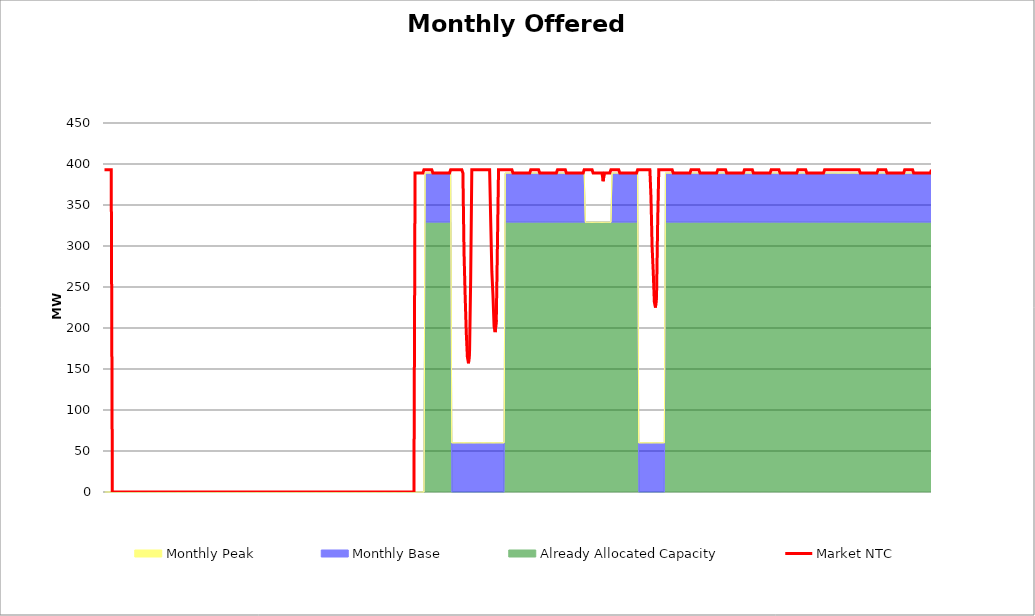
| Category | Market NTC |
|---|---|
| 0 | 393 |
| 1 | 393 |
| 2 | 393 |
| 3 | 393 |
| 4 | 393 |
| 5 | 393 |
| 6 | 393 |
| 7 | 0 |
| 8 | 0 |
| 9 | 0 |
| 10 | 0 |
| 11 | 0 |
| 12 | 0 |
| 13 | 0 |
| 14 | 0 |
| 15 | 0 |
| 16 | 0 |
| 17 | 0 |
| 18 | 0 |
| 19 | 0 |
| 20 | 0 |
| 21 | 0 |
| 22 | 0 |
| 23 | 0 |
| 24 | 0 |
| 25 | 0 |
| 26 | 0 |
| 27 | 0 |
| 28 | 0 |
| 29 | 0 |
| 30 | 0 |
| 31 | 0 |
| 32 | 0 |
| 33 | 0 |
| 34 | 0 |
| 35 | 0 |
| 36 | 0 |
| 37 | 0 |
| 38 | 0 |
| 39 | 0 |
| 40 | 0 |
| 41 | 0 |
| 42 | 0 |
| 43 | 0 |
| 44 | 0 |
| 45 | 0 |
| 46 | 0 |
| 47 | 0 |
| 48 | 0 |
| 49 | 0 |
| 50 | 0 |
| 51 | 0 |
| 52 | 0 |
| 53 | 0 |
| 54 | 0 |
| 55 | 0 |
| 56 | 0 |
| 57 | 0 |
| 58 | 0 |
| 59 | 0 |
| 60 | 0 |
| 61 | 0 |
| 62 | 0 |
| 63 | 0 |
| 64 | 0 |
| 65 | 0 |
| 66 | 0 |
| 67 | 0 |
| 68 | 0 |
| 69 | 0 |
| 70 | 0 |
| 71 | 0 |
| 72 | 0 |
| 73 | 0 |
| 74 | 0 |
| 75 | 0 |
| 76 | 0 |
| 77 | 0 |
| 78 | 0 |
| 79 | 0 |
| 80 | 0 |
| 81 | 0 |
| 82 | 0 |
| 83 | 0 |
| 84 | 0 |
| 85 | 0 |
| 86 | 0 |
| 87 | 0 |
| 88 | 0 |
| 89 | 0 |
| 90 | 0 |
| 91 | 0 |
| 92 | 0 |
| 93 | 0 |
| 94 | 0 |
| 95 | 0 |
| 96 | 0 |
| 97 | 0 |
| 98 | 0 |
| 99 | 0 |
| 100 | 0 |
| 101 | 0 |
| 102 | 0 |
| 103 | 0 |
| 104 | 0 |
| 105 | 0 |
| 106 | 0 |
| 107 | 0 |
| 108 | 0 |
| 109 | 0 |
| 110 | 0 |
| 111 | 0 |
| 112 | 0 |
| 113 | 0 |
| 114 | 0 |
| 115 | 0 |
| 116 | 0 |
| 117 | 0 |
| 118 | 0 |
| 119 | 0 |
| 120 | 0 |
| 121 | 0 |
| 122 | 0 |
| 123 | 0 |
| 124 | 0 |
| 125 | 0 |
| 126 | 0 |
| 127 | 0 |
| 128 | 0 |
| 129 | 0 |
| 130 | 0 |
| 131 | 0 |
| 132 | 0 |
| 133 | 0 |
| 134 | 0 |
| 135 | 0 |
| 136 | 0 |
| 137 | 0 |
| 138 | 0 |
| 139 | 0 |
| 140 | 0 |
| 141 | 0 |
| 142 | 0 |
| 143 | 0 |
| 144 | 0 |
| 145 | 0 |
| 146 | 0 |
| 147 | 0 |
| 148 | 0 |
| 149 | 0 |
| 150 | 0 |
| 151 | 0 |
| 152 | 0 |
| 153 | 0 |
| 154 | 0 |
| 155 | 0 |
| 156 | 0 |
| 157 | 0 |
| 158 | 0 |
| 159 | 0 |
| 160 | 0 |
| 161 | 0 |
| 162 | 0 |
| 163 | 0 |
| 164 | 0 |
| 165 | 0 |
| 166 | 0 |
| 167 | 0 |
| 168 | 0 |
| 169 | 0 |
| 170 | 0 |
| 171 | 0 |
| 172 | 0 |
| 173 | 0 |
| 174 | 0 |
| 175 | 0 |
| 176 | 0 |
| 177 | 0 |
| 178 | 0 |
| 179 | 0 |
| 180 | 0 |
| 181 | 0 |
| 182 | 0 |
| 183 | 0 |
| 184 | 0 |
| 185 | 0 |
| 186 | 0 |
| 187 | 0 |
| 188 | 0 |
| 189 | 0 |
| 190 | 0 |
| 191 | 0 |
| 192 | 0 |
| 193 | 0 |
| 194 | 0 |
| 195 | 0 |
| 196 | 0 |
| 197 | 0 |
| 198 | 0 |
| 199 | 0 |
| 200 | 0 |
| 201 | 0 |
| 202 | 0 |
| 203 | 0 |
| 204 | 0 |
| 205 | 0 |
| 206 | 0 |
| 207 | 0 |
| 208 | 0 |
| 209 | 0 |
| 210 | 0 |
| 211 | 0 |
| 212 | 0 |
| 213 | 0 |
| 214 | 0 |
| 215 | 0 |
| 216 | 0 |
| 217 | 0 |
| 218 | 0 |
| 219 | 0 |
| 220 | 0 |
| 221 | 0 |
| 222 | 0 |
| 223 | 0 |
| 224 | 0 |
| 225 | 0 |
| 226 | 0 |
| 227 | 0 |
| 228 | 0 |
| 229 | 0 |
| 230 | 0 |
| 231 | 0 |
| 232 | 0 |
| 233 | 0 |
| 234 | 0 |
| 235 | 0 |
| 236 | 0 |
| 237 | 0 |
| 238 | 0 |
| 239 | 0 |
| 240 | 0 |
| 241 | 0 |
| 242 | 0 |
| 243 | 0 |
| 244 | 0 |
| 245 | 0 |
| 246 | 0 |
| 247 | 0 |
| 248 | 0 |
| 249 | 0 |
| 250 | 0 |
| 251 | 0 |
| 252 | 0 |
| 253 | 0 |
| 254 | 0 |
| 255 | 0 |
| 256 | 0 |
| 257 | 0 |
| 258 | 0 |
| 259 | 0 |
| 260 | 0 |
| 261 | 0 |
| 262 | 0 |
| 263 | 0 |
| 264 | 0 |
| 265 | 0 |
| 266 | 0 |
| 267 | 0 |
| 268 | 0 |
| 269 | 0 |
| 270 | 0 |
| 271 | 0 |
| 272 | 0 |
| 273 | 0 |
| 274 | 0 |
| 275 | 0 |
| 276 | 0 |
| 277 | 0 |
| 278 | 0 |
| 279 | 389 |
| 280 | 389 |
| 281 | 389 |
| 282 | 389 |
| 283 | 389 |
| 284 | 389 |
| 285 | 389 |
| 286 | 389 |
| 287 | 393 |
| 288 | 393 |
| 289 | 393 |
| 290 | 393 |
| 291 | 393 |
| 292 | 393 |
| 293 | 393 |
| 294 | 393 |
| 295 | 389 |
| 296 | 389 |
| 297 | 389 |
| 298 | 389 |
| 299 | 389 |
| 300 | 389 |
| 301 | 389 |
| 302 | 389 |
| 303 | 389 |
| 304 | 389 |
| 305 | 389 |
| 306 | 389 |
| 307 | 389 |
| 308 | 389 |
| 309 | 389 |
| 310 | 389 |
| 311 | 393 |
| 312 | 393 |
| 313 | 393 |
| 314 | 393 |
| 315 | 393 |
| 316 | 393 |
| 317 | 393 |
| 318 | 393 |
| 319 | 393 |
| 320 | 393 |
| 321 | 393 |
| 322 | 389 |
| 323 | 292 |
| 324 | 240 |
| 325 | 195 |
| 326 | 165 |
| 327 | 157 |
| 328 | 172 |
| 329 | 262 |
| 330 | 393 |
| 331 | 393 |
| 332 | 393 |
| 333 | 393 |
| 334 | 393 |
| 335 | 393 |
| 336 | 393 |
| 337 | 393 |
| 338 | 393 |
| 339 | 393 |
| 340 | 393 |
| 341 | 393 |
| 342 | 393 |
| 343 | 393 |
| 344 | 393 |
| 345 | 393 |
| 346 | 393 |
| 347 | 329 |
| 348 | 269 |
| 349 | 240 |
| 350 | 202 |
| 351 | 195 |
| 352 | 210 |
| 353 | 299 |
| 354 | 393 |
| 355 | 393 |
| 356 | 393 |
| 357 | 393 |
| 358 | 393 |
| 359 | 393 |
| 360 | 393 |
| 361 | 393 |
| 362 | 393 |
| 363 | 393 |
| 364 | 393 |
| 365 | 393 |
| 366 | 393 |
| 367 | 389 |
| 368 | 389 |
| 369 | 389 |
| 370 | 389 |
| 371 | 389 |
| 372 | 389 |
| 373 | 389 |
| 374 | 389 |
| 375 | 389 |
| 376 | 389 |
| 377 | 389 |
| 378 | 389 |
| 379 | 389 |
| 380 | 389 |
| 381 | 389 |
| 382 | 389 |
| 383 | 393 |
| 384 | 393 |
| 385 | 393 |
| 386 | 393 |
| 387 | 393 |
| 388 | 393 |
| 389 | 393 |
| 390 | 393 |
| 391 | 389 |
| 392 | 389 |
| 393 | 389 |
| 394 | 389 |
| 395 | 389 |
| 396 | 389 |
| 397 | 389 |
| 398 | 389 |
| 399 | 389 |
| 400 | 389 |
| 401 | 389 |
| 402 | 389 |
| 403 | 389 |
| 404 | 389 |
| 405 | 389 |
| 406 | 389 |
| 407 | 393 |
| 408 | 393 |
| 409 | 393 |
| 410 | 393 |
| 411 | 393 |
| 412 | 393 |
| 413 | 393 |
| 414 | 393 |
| 415 | 389 |
| 416 | 389 |
| 417 | 389 |
| 418 | 389 |
| 419 | 389 |
| 420 | 389 |
| 421 | 389 |
| 422 | 389 |
| 423 | 389 |
| 424 | 389 |
| 425 | 389 |
| 426 | 389 |
| 427 | 389 |
| 428 | 389 |
| 429 | 389 |
| 430 | 389 |
| 431 | 393 |
| 432 | 393 |
| 433 | 393 |
| 434 | 393 |
| 435 | 393 |
| 436 | 393 |
| 437 | 393 |
| 438 | 393 |
| 439 | 389 |
| 440 | 389 |
| 441 | 389 |
| 442 | 389 |
| 443 | 389 |
| 444 | 389 |
| 445 | 389 |
| 446 | 389 |
| 447 | 389 |
| 448 | 379 |
| 449 | 389 |
| 450 | 389 |
| 451 | 389 |
| 452 | 389 |
| 453 | 389 |
| 454 | 389 |
| 455 | 393 |
| 456 | 393 |
| 457 | 393 |
| 458 | 393 |
| 459 | 393 |
| 460 | 393 |
| 461 | 393 |
| 462 | 393 |
| 463 | 389 |
| 464 | 389 |
| 465 | 389 |
| 466 | 389 |
| 467 | 389 |
| 468 | 389 |
| 469 | 389 |
| 470 | 389 |
| 471 | 389 |
| 472 | 389 |
| 473 | 389 |
| 474 | 389 |
| 475 | 389 |
| 476 | 389 |
| 477 | 389 |
| 478 | 389 |
| 479 | 393 |
| 480 | 393 |
| 481 | 393 |
| 482 | 393 |
| 483 | 393 |
| 484 | 393 |
| 485 | 393 |
| 486 | 393 |
| 487 | 393 |
| 488 | 393 |
| 489 | 393 |
| 490 | 393 |
| 491 | 359 |
| 492 | 299 |
| 493 | 269 |
| 494 | 232 |
| 495 | 225 |
| 496 | 240 |
| 497 | 329 |
| 498 | 393 |
| 499 | 393 |
| 500 | 393 |
| 501 | 393 |
| 502 | 393 |
| 503 | 393 |
| 504 | 393 |
| 505 | 393 |
| 506 | 393 |
| 507 | 393 |
| 508 | 393 |
| 509 | 393 |
| 510 | 393 |
| 511 | 389 |
| 512 | 389 |
| 513 | 389 |
| 514 | 389 |
| 515 | 389 |
| 516 | 389 |
| 517 | 389 |
| 518 | 389 |
| 519 | 389 |
| 520 | 389 |
| 521 | 389 |
| 522 | 389 |
| 523 | 389 |
| 524 | 389 |
| 525 | 389 |
| 526 | 389 |
| 527 | 393 |
| 528 | 393 |
| 529 | 393 |
| 530 | 393 |
| 531 | 393 |
| 532 | 393 |
| 533 | 393 |
| 534 | 393 |
| 535 | 389 |
| 536 | 389 |
| 537 | 389 |
| 538 | 389 |
| 539 | 389 |
| 540 | 389 |
| 541 | 389 |
| 542 | 389 |
| 543 | 389 |
| 544 | 389 |
| 545 | 389 |
| 546 | 389 |
| 547 | 389 |
| 548 | 389 |
| 549 | 389 |
| 550 | 389 |
| 551 | 393 |
| 552 | 393 |
| 553 | 393 |
| 554 | 393 |
| 555 | 393 |
| 556 | 393 |
| 557 | 393 |
| 558 | 393 |
| 559 | 389 |
| 560 | 389 |
| 561 | 389 |
| 562 | 389 |
| 563 | 389 |
| 564 | 389 |
| 565 | 389 |
| 566 | 389 |
| 567 | 389 |
| 568 | 389 |
| 569 | 389 |
| 570 | 389 |
| 571 | 389 |
| 572 | 389 |
| 573 | 389 |
| 574 | 389 |
| 575 | 393 |
| 576 | 393 |
| 577 | 393 |
| 578 | 393 |
| 579 | 393 |
| 580 | 393 |
| 581 | 393 |
| 582 | 393 |
| 583 | 389 |
| 584 | 389 |
| 585 | 389 |
| 586 | 389 |
| 587 | 389 |
| 588 | 389 |
| 589 | 389 |
| 590 | 389 |
| 591 | 389 |
| 592 | 389 |
| 593 | 389 |
| 594 | 389 |
| 595 | 389 |
| 596 | 389 |
| 597 | 389 |
| 598 | 389 |
| 599 | 393 |
| 600 | 393 |
| 601 | 393 |
| 602 | 393 |
| 603 | 393 |
| 604 | 393 |
| 605 | 393 |
| 606 | 393 |
| 607 | 389 |
| 608 | 389 |
| 609 | 389 |
| 610 | 389 |
| 611 | 389 |
| 612 | 389 |
| 613 | 389 |
| 614 | 389 |
| 615 | 389 |
| 616 | 389 |
| 617 | 389 |
| 618 | 389 |
| 619 | 389 |
| 620 | 389 |
| 621 | 389 |
| 622 | 389 |
| 623 | 393 |
| 624 | 393 |
| 625 | 393 |
| 626 | 393 |
| 627 | 393 |
| 628 | 393 |
| 629 | 393 |
| 630 | 393 |
| 631 | 389 |
| 632 | 389 |
| 633 | 389 |
| 634 | 389 |
| 635 | 389 |
| 636 | 389 |
| 637 | 389 |
| 638 | 389 |
| 639 | 389 |
| 640 | 389 |
| 641 | 389 |
| 642 | 389 |
| 643 | 389 |
| 644 | 389 |
| 645 | 389 |
| 646 | 389 |
| 647 | 393 |
| 648 | 393 |
| 649 | 393 |
| 650 | 393 |
| 651 | 393 |
| 652 | 393 |
| 653 | 393 |
| 654 | 393 |
| 655 | 393 |
| 656 | 393 |
| 657 | 393 |
| 658 | 393 |
| 659 | 393 |
| 660 | 393 |
| 661 | 393 |
| 662 | 393 |
| 663 | 393 |
| 664 | 393 |
| 665 | 393 |
| 666 | 393 |
| 667 | 393 |
| 668 | 393 |
| 669 | 393 |
| 670 | 393 |
| 671 | 393 |
| 672 | 393 |
| 673 | 393 |
| 674 | 393 |
| 675 | 393 |
| 676 | 393 |
| 677 | 393 |
| 678 | 393 |
| 679 | 389 |
| 680 | 389 |
| 681 | 389 |
| 682 | 389 |
| 683 | 389 |
| 684 | 389 |
| 685 | 389 |
| 686 | 389 |
| 687 | 389 |
| 688 | 389 |
| 689 | 389 |
| 690 | 389 |
| 691 | 389 |
| 692 | 389 |
| 693 | 389 |
| 694 | 389 |
| 695 | 393 |
| 696 | 393 |
| 697 | 393 |
| 698 | 393 |
| 699 | 393 |
| 700 | 393 |
| 701 | 393 |
| 702 | 393 |
| 703 | 389 |
| 704 | 389 |
| 705 | 389 |
| 706 | 389 |
| 707 | 389 |
| 708 | 389 |
| 709 | 389 |
| 710 | 389 |
| 711 | 389 |
| 712 | 389 |
| 713 | 389 |
| 714 | 389 |
| 715 | 389 |
| 716 | 389 |
| 717 | 389 |
| 718 | 389 |
| 719 | 393 |
| 720 | 393 |
| 721 | 393 |
| 722 | 393 |
| 723 | 393 |
| 724 | 393 |
| 725 | 393 |
| 726 | 393 |
| 727 | 389 |
| 728 | 389 |
| 729 | 389 |
| 730 | 389 |
| 731 | 389 |
| 732 | 389 |
| 733 | 389 |
| 734 | 389 |
| 735 | 389 |
| 736 | 389 |
| 737 | 389 |
| 738 | 389 |
| 739 | 389 |
| 740 | 389 |
| 741 | 389 |
| 742 | 389 |
| 743 | 393 |